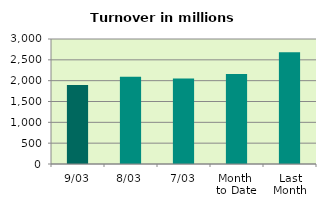
| Category | Series 0 |
|---|---|
| 9/03 | 1896.792 |
| 8/03 | 2092.626 |
| 7/03 | 2049.324 |
| Month 
to Date | 2157.102 |
| Last
Month | 2679.99 |